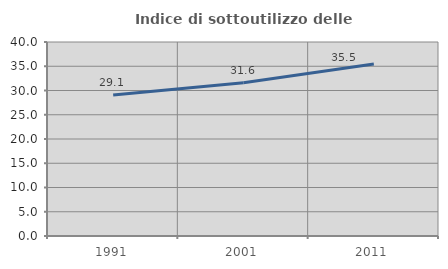
| Category | Indice di sottoutilizzo delle abitazioni  |
|---|---|
| 1991.0 | 29.075 |
| 2001.0 | 31.6 |
| 2011.0 | 35.461 |